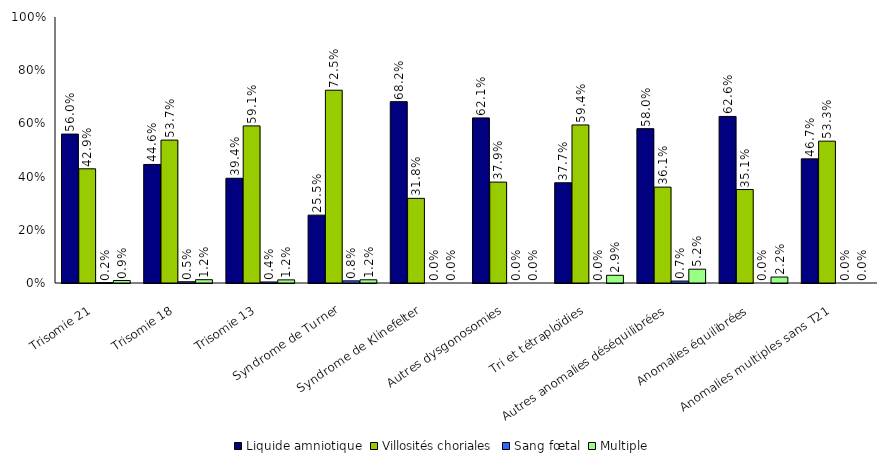
| Category | Liquide amniotique | Villosités choriales | Sang fœtal | Multiple |
|---|---|---|---|---|
| Trisomie 21 | 0.56 | 0.429 | 0.002 | 0.009 |
| Trisomie 18 | 0.446 | 0.537 | 0.005 | 0.012 |
| Trisomie 13 | 0.394 | 0.591 | 0.004 | 0.012 |
| Syndrome de Turner | 0.255 | 0.725 | 0.008 | 0.012 |
| Syndrome de Klinefelter | 0.682 | 0.318 | 0 | 0 |
| Autres dysgonosomies | 0.621 | 0.379 | 0 | 0 |
| Tri et tétraploïdies | 0.377 | 0.594 | 0 | 0.029 |
| Autres anomalies déséquilibrées | 0.58 | 0.36 | 0.007 | 0.052 |
| Anomalies équilibrées | 0.626 | 0.351 | 0 | 0.022 |
| Anomalies multiples sans T21 | 0.467 | 0.533 | 0 | 0 |